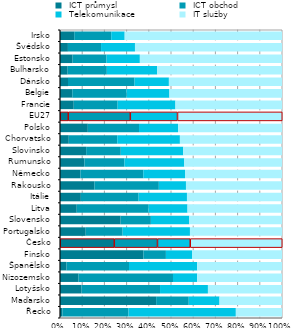
| Category |  ICT průmysl |  ICT obchod |  Telekomunikace |  IT služby |
|---|---|---|---|---|
| Řecko | 0.011 | 0.297 | 0.484 | 0.208 |
| Maďarsko | 0.433 | 0.147 | 0.139 | 0.281 |
| Lotyšsko | 0.097 | 0.354 | 0.216 | 0.334 |
| Nizozemsko | 0.084 | 0.425 | 0.109 | 0.382 |
| Španělsko | 0.029 | 0.282 | 0.307 | 0.382 |
| Finsko | 0.376 | 0.101 | 0.118 | 0.405 |
| Česko | 0.243 | 0.195 | 0.148 | 0.414 |
| Portugalsko | 0.116 | 0.166 | 0.303 | 0.415 |
| Slovensko | 0.273 | 0.136 | 0.173 | 0.417 |
| Litva | 0.075 | 0.323 | 0.176 | 0.426 |
| Itálie | 0.094 | 0.26 | 0.218 | 0.428 |
| Rakousko | 0.155 | 0.29 | 0.122 | 0.433 |
| Německo | 0.092 | 0.283 | 0.188 | 0.437 |
| Rumunsko | 0.11 | 0.18 | 0.269 | 0.44 |
| Slovinsko | 0.118 | 0.156 | 0.281 | 0.445 |
| Chorvatsko | 0.04 | 0.219 | 0.282 | 0.46 |
| Polsko | 0.125 | 0.231 | 0.176 | 0.468 |
| EU27 | 0.036 | 0.279 | 0.213 | 0.472 |
| Francie | 0.062 | 0.198 | 0.26 | 0.48 |
| Belgie | 0.055 | 0.245 | 0.193 | 0.507 |
| Dánsko | 0.036 | 0.3 | 0.155 | 0.509 |
| Bulharsko | 0.034 | 0.177 | 0.227 | 0.562 |
| Estonsko | 0.057 | 0.153 | 0.15 | 0.64 |
| Švédsko | 0.036 | 0.149 | 0.153 | 0.662 |
| Irsko | 0.064 | 0.167 | 0.061 | 0.709 |